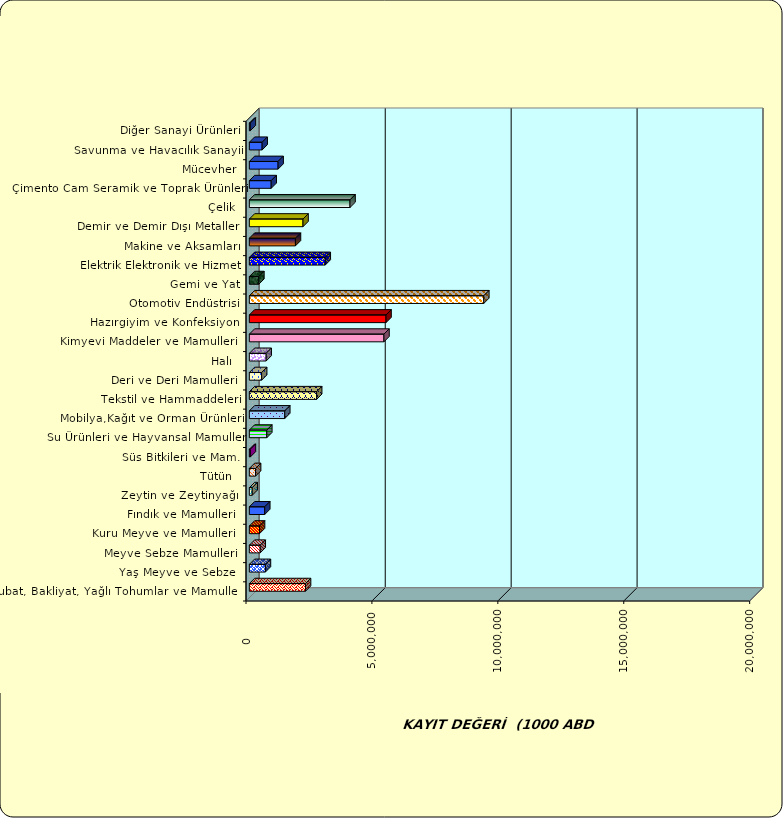
| Category | Series 0 |
|---|---|
|  Hububat, Bakliyat, Yağlı Tohumlar ve Mamulleri  | 2230192.886 |
|  Yaş Meyve ve Sebze   | 637972.376 |
|  Meyve Sebze Mamulleri  | 431785.801 |
|  Kuru Meyve ve Mamulleri   | 403775.11 |
|  Fındık ve Mamulleri  | 611322.279 |
|  Zeytin ve Zeytinyağı  | 113508.537 |
|  Tütün  | 246645.727 |
|  Süs Bitkileri ve Mam. | 40802.223 |
|  Su Ürünleri ve Hayvansal Mamuller | 692623.774 |
|  Mobilya,Kağıt ve Orman Ürünleri | 1405817.904 |
|  Tekstil ve Hammaddeleri | 2671709.715 |
|  Deri ve Deri Mamulleri  | 487506.165 |
|  Halı  | 667602.253 |
|  Kimyevi Maddeler ve Mamulleri   | 5344445.2 |
|  Hazırgiyim ve Konfeksiyon  | 5427006.739 |
|  Otomotiv Endüstrisi | 9309701.18 |
|  Gemi ve Yat | 375757.216 |
|  Elektrik Elektronik ve Hizmet | 3013578.825 |
|  Makine ve Aksamları | 1830146.206 |
|  Demir ve Demir Dışı Metaller  | 2130974.759 |
|  Çelik | 3997162.358 |
|  Çimento Cam Seramik ve Toprak Ürünleri | 867169.252 |
|  Mücevher | 1141037.97 |
|  Savunma ve Havacılık Sanayii | 507866.686 |
|  Diğer Sanayi Ürünleri | 37643.9 |